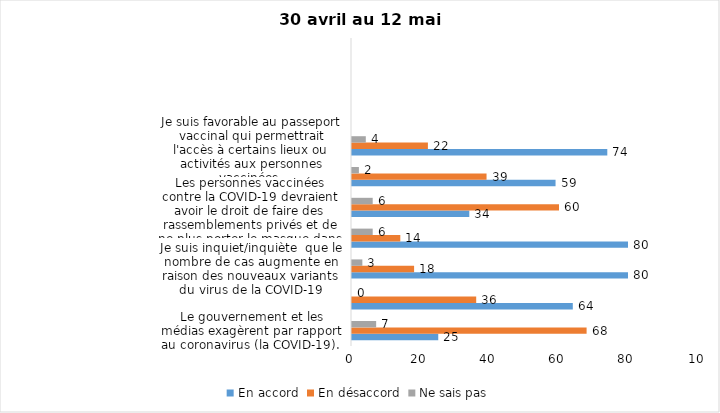
| Category | En accord | En désaccord | Ne sais pas |
|---|---|---|---|
| Le gouvernement et les médias exagèrent par rapport au coronavirus (la COVID-19). | 25 | 68 | 7 |
| Je suis favorable au maintien du couvre-feu pour les prochaines semaines. | 64 | 36 | 0 |
| Je suis inquiet/inquiète  que le nombre de cas augmente en raison des nouveaux variants du virus de la COVID-19 | 80 | 18 | 3 |
| La frontière entre le Canada et les États-Unis devrait être fermée au moins jusqu’en septembre 2021 | 80 | 14 | 6 |
| Les personnes vaccinées contre la COVID-19 devraient avoir le droit de faire des rassemblements privés et de ne plus porter le masque dans les lieux publics. | 34 | 60 | 6 |
| Je suis favorable au port du masque à l'extérieur en tout temps lorsqu'on est avec des personnes avec qui l'on n'habite pas. | 59 | 39 | 2 |
| Je suis favorable au passeport vaccinal qui permettrait l'accès à certains lieux ou activités aux personnes vaccinées. | 74 | 22 | 4 |